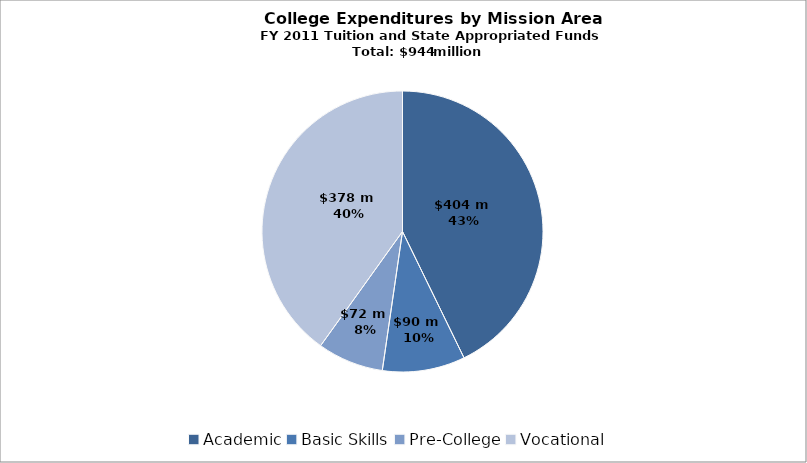
| Category | Series 0 |
|---|---|
| Academic | 403714430.829 |
| Basic Skills | 89764722.525 |
| Pre-College | 71759568.99 |
| Vocational | 378339856.655 |